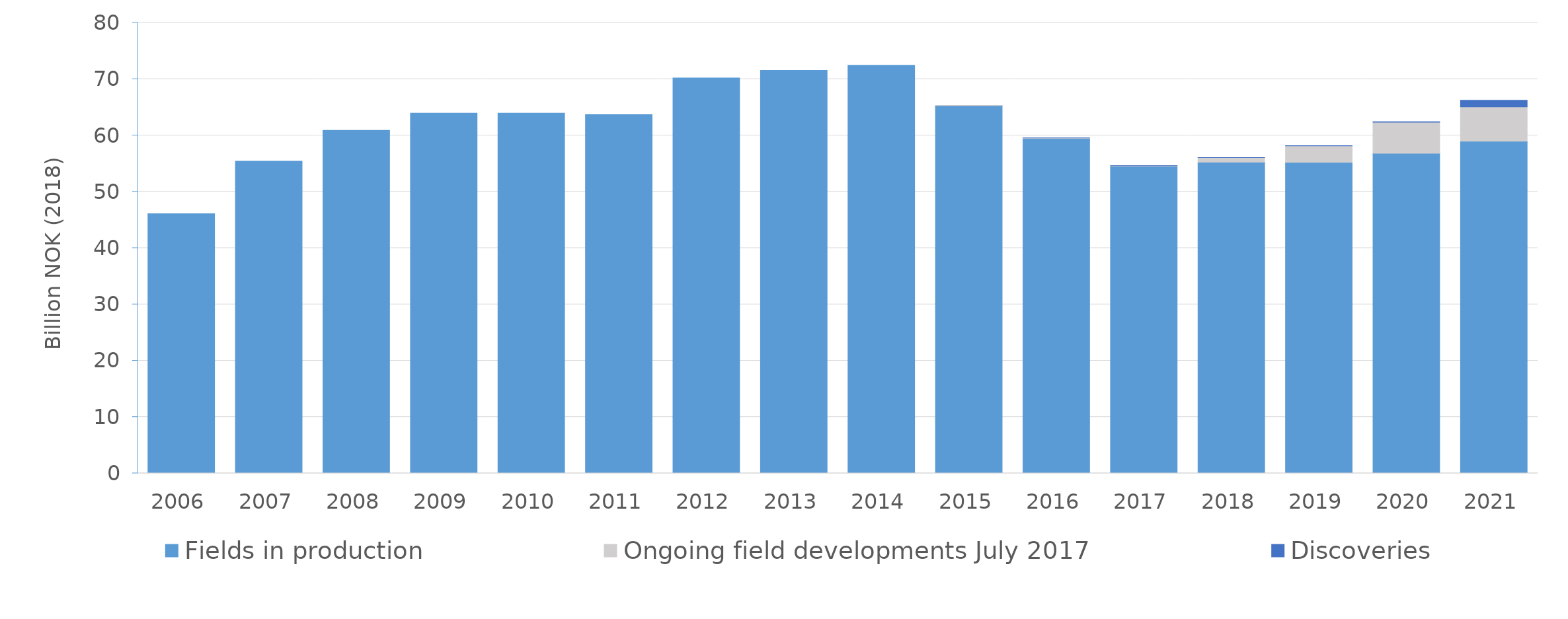
| Category | Fields in production | Ongoing field developments July 2017 | Discoveries |
|---|---|---|---|
| 2006.0 | 46.086 | 0 | 0 |
| 2007.0 | 55.415 | 0 | 0 |
| 2008.0 | 60.912 | 0 | 0 |
| 2009.0 | 63.969 | 0 | 0 |
| 2010.0 | 63.97 | 0 | 0 |
| 2011.0 | 63.692 | 0 | 0 |
| 2012.0 | 70.2 | 0 | 0 |
| 2013.0 | 71.566 | 0 | 0 |
| 2014.0 | 72.457 | 0 | 0 |
| 2015.0 | 65.313 | 0.029 | 0 |
| 2016.0 | 59.476 | 0.078 | 0.003 |
| 2017.0 | 54.548 | 0.089 | 0.003 |
| 2018.0 | 55.256 | 0.814 | 0.011 |
| 2019.0 | 55.233 | 2.917 | 0.019 |
| 2020.0 | 56.825 | 5.532 | 0.084 |
| 2021.0 | 58.976 | 6.11 | 1.168 |